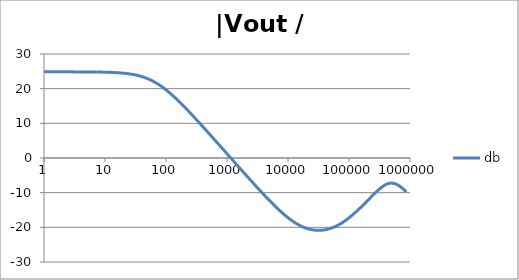
| Category | db |
|---|---|
| 1.0 | 24.851 |
| 1.0715193052376064 | 24.851 |
| 1.1481536214968828 | 24.851 |
| 1.2302687708123814 | 24.851 |
| 1.318256738556407 | 24.85 |
| 1.4125375446227544 | 24.85 |
| 1.513561248436208 | 24.85 |
| 1.6218100973589298 | 24.849 |
| 1.7378008287493754 | 24.849 |
| 1.8620871366628673 | 24.849 |
| 1.9952623149688797 | 24.848 |
| 2.1379620895022318 | 24.848 |
| 2.2908676527677727 | 24.847 |
| 2.45470891568503 | 24.846 |
| 2.6302679918953817 | 24.845 |
| 2.8183829312644537 | 24.844 |
| 3.0199517204020156 | 24.843 |
| 3.235936569296282 | 24.842 |
| 3.467368504525316 | 24.84 |
| 3.7153522909717256 | 24.838 |
| 3.9810717055349727 | 24.836 |
| 4.265795188015926 | 24.834 |
| 4.570881896148749 | 24.831 |
| 4.897788193684462 | 24.828 |
| 5.2480746024977245 | 24.825 |
| 5.62341325190349 | 24.821 |
| 6.025595860743575 | 24.816 |
| 6.456542290346554 | 24.811 |
| 6.918309709189363 | 24.804 |
| 7.4131024130091765 | 24.797 |
| 7.943282347242814 | 24.789 |
| 8.511380382023765 | 24.78 |
| 9.120108393559095 | 24.77 |
| 9.772372209558105 | 24.758 |
| 10.47128548050899 | 24.744 |
| 11.22018454301963 | 24.728 |
| 12.022644346174127 | 24.71 |
| 12.88249551693134 | 24.689 |
| 13.803842646028851 | 24.665 |
| 14.791083881682074 | 24.638 |
| 15.848931924611136 | 24.608 |
| 16.98243652461744 | 24.573 |
| 18.197008586099834 | 24.533 |
| 19.498445997580447 | 24.487 |
| 20.892961308540382 | 24.436 |
| 22.387211385683386 | 24.377 |
| 23.988329190194897 | 24.311 |
| 25.703957827688622 | 24.237 |
| 27.54228703338165 | 24.152 |
| 29.51209226666385 | 24.058 |
| 31.62277660168379 | 23.952 |
| 33.884415613920254 | 23.833 |
| 36.307805477010106 | 23.7 |
| 38.90451449942804 | 23.553 |
| 41.686938347033525 | 23.389 |
| 44.6683592150963 | 23.209 |
| 47.86300923226381 | 23.011 |
| 51.28613839913647 | 22.794 |
| 54.95408738576247 | 22.558 |
| 58.88436553555889 | 22.302 |
| 63.09573444801931 | 22.025 |
| 67.60829753919813 | 21.728 |
| 72.44359600749901 | 21.41 |
| 77.62471166286915 | 21.071 |
| 83.17637711026705 | 20.712 |
| 89.12509381337456 | 20.334 |
| 95.49925860214357 | 19.936 |
| 102.32929922807544 | 19.521 |
| 109.64781961431841 | 19.088 |
| 117.48975549395293 | 18.64 |
| 125.89254117941665 | 18.176 |
| 134.89628825916537 | 17.698 |
| 144.54397707459273 | 17.207 |
| 154.88166189124806 | 16.705 |
| 165.95869074375608 | 16.192 |
| 177.82794100389225 | 15.669 |
| 190.5460717963248 | 15.137 |
| 204.17379446695278 | 14.597 |
| 218.77616239495524 | 14.051 |
| 234.42288153199212 | 13.498 |
| 251.18864315095806 | 12.939 |
| 269.15348039269156 | 12.375 |
| 288.4031503126605 | 11.807 |
| 309.0295432513591 | 11.235 |
| 331.1311214825911 | 10.66 |
| 354.81338923357566 | 10.082 |
| 380.18939632056095 | 9.501 |
| 407.3802778041123 | 8.918 |
| 436.5158322401654 | 8.332 |
| 467.7351412871979 | 7.745 |
| 501.18723362727184 | 7.157 |
| 537.0317963702526 | 6.567 |
| 575.4399373371566 | 5.976 |
| 616.5950018614822 | 5.384 |
| 660.6934480075952 | 4.792 |
| 707.9457843841375 | 4.198 |
| 758.5775750291831 | 3.605 |
| 812.8305161640983 | 3.01 |
| 870.9635899560801 | 2.416 |
| 933.2543007969903 | 1.821 |
| 999.9999999999998 | 1.226 |
| 1071.5193052376057 | 0.631 |
| 1148.1536214968828 | 0.036 |
| 1230.2687708123801 | -0.558 |
| 1318.2567385564053 | -1.153 |
| 1412.537544622753 | -1.747 |
| 1513.5612484362066 | -2.34 |
| 1621.8100973589292 | -2.933 |
| 1737.8008287493742 | -3.525 |
| 1862.0871366628671 | -4.116 |
| 1995.2623149688786 | -4.706 |
| 2137.9620895022326 | -5.295 |
| 2290.867652767771 | -5.882 |
| 2454.708915685027 | -6.468 |
| 2630.26799189538 | -7.052 |
| 2818.382931264451 | -7.633 |
| 3019.9517204020176 | -8.212 |
| 3235.9365692962774 | -8.788 |
| 3467.368504525316 | -9.361 |
| 3715.352290971724 | -9.929 |
| 3981.07170553497 | -10.494 |
| 4265.795188015923 | -11.054 |
| 4570.881896148745 | -11.608 |
| 4897.788193684463 | -12.155 |
| 5248.074602497726 | -12.696 |
| 5623.413251903489 | -13.229 |
| 6025.595860743574 | -13.753 |
| 6456.54229034655 | -14.267 |
| 6918.309709189357 | -14.771 |
| 7413.102413009165 | -15.262 |
| 7943.282347242815 | -15.74 |
| 8511.380382023763 | -16.204 |
| 9120.108393559092 | -16.652 |
| 9772.3722095581 | -17.083 |
| 10471.285480509003 | -17.495 |
| 11220.184543019639 | -17.888 |
| 12022.64434617411 | -18.26 |
| 12882.495516931338 | -18.61 |
| 13803.842646028841 | -18.937 |
| 14791.083881682063 | -19.24 |
| 15848.931924611119 | -19.519 |
| 16982.436524617453 | -19.772 |
| 18197.008586099837 | -20 |
| 19498.445997580417 | -20.201 |
| 20892.961308540387 | -20.376 |
| 22387.211385683382 | -20.525 |
| 23988.32919019488 | -20.646 |
| 25703.957827688606 | -20.742 |
| 27542.28703338167 | -20.81 |
| 29512.092266663854 | -20.852 |
| 31622.77660168378 | -20.867 |
| 33884.41561392023 | -20.856 |
| 36307.805477010166 | -20.818 |
| 38904.514499428085 | -20.753 |
| 41686.93834703348 | -20.662 |
| 44668.35921509631 | -20.543 |
| 47863.00923226382 | -20.398 |
| 51286.13839913646 | -20.227 |
| 54954.08738576241 | -20.029 |
| 58884.365535558936 | -19.804 |
| 63095.73444801934 | -19.553 |
| 67608.29753919817 | -19.277 |
| 72443.59600749899 | -18.976 |
| 77624.71166286913 | -18.65 |
| 83176.37711026703 | -18.301 |
| 89125.09381337445 | -17.929 |
| 95499.25860214363 | -17.536 |
| 102329.29922807543 | -17.123 |
| 109647.81961431848 | -16.691 |
| 117489.75549395289 | -16.241 |
| 125892.54117941685 | -15.775 |
| 134896.28825916522 | -15.295 |
| 144543.97707459255 | -14.801 |
| 154881.66189124787 | -14.295 |
| 165958.69074375575 | -13.78 |
| 177827.9410038922 | -13.256 |
| 190546.07179632425 | -12.725 |
| 204173.79446695274 | -12.191 |
| 218776.16239495497 | -11.655 |
| 234422.88153199226 | -11.121 |
| 251188.64315095753 | -10.592 |
| 269153.480392691 | -10.074 |
| 288403.15031266044 | -9.573 |
| 309029.5432513582 | -9.095 |
| 331131.1214825907 | -8.649 |
| 354813.3892335749 | -8.245 |
| 380189.3963205612 | -7.895 |
| 407380.2778041119 | -7.61 |
| 436515.8322401649 | -7.4 |
| 467735.14128719777 | -7.275 |
| 501187.2336272717 | -7.242 |
| 537031.7963702519 | -7.302 |
| 575439.9373371559 | -7.454 |
| 616595.001861482 | -7.69 |
| 660693.4480075944 | -8.003 |
| 707945.7843841374 | -8.382 |
| 758577.575029183 | -8.815 |
| 812830.5161640996 | -9.292 |
| 870963.5899560791 | -9.804 |